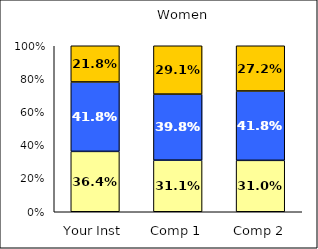
| Category | Low Pluralistic Orientation | Average Pluralistic Orientation | High Pluralistic Orientation |
|---|---|---|---|
| Your Inst | 0.364 | 0.418 | 0.218 |
| Comp 1 | 0.311 | 0.398 | 0.291 |
| Comp 2 | 0.31 | 0.418 | 0.272 |